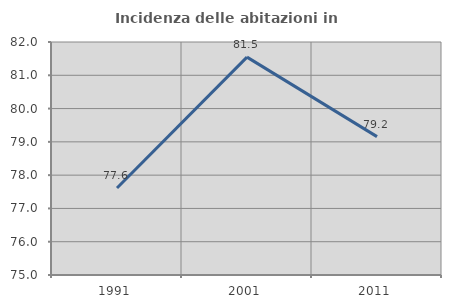
| Category | Incidenza delle abitazioni in proprietà  |
|---|---|
| 1991.0 | 77.612 |
| 2001.0 | 81.546 |
| 2011.0 | 79.156 |